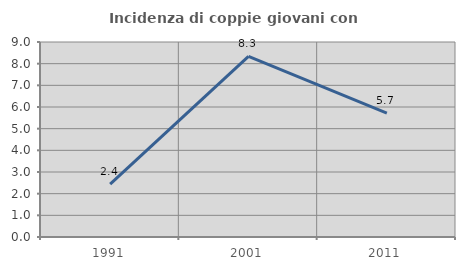
| Category | Incidenza di coppie giovani con figli |
|---|---|
| 1991.0 | 2.439 |
| 2001.0 | 8.333 |
| 2011.0 | 5.714 |